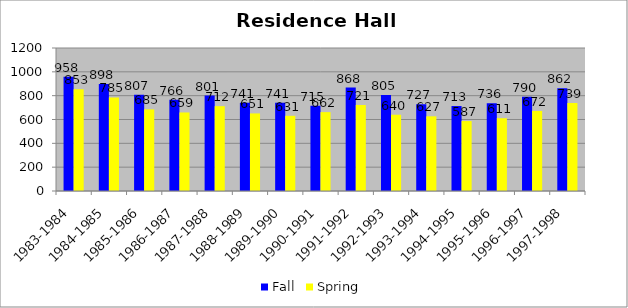
| Category | Fall | Spring |
|---|---|---|
| 1983-1984 | 958 | 853 |
| 1984-1985 | 898 | 785 |
| 1985-1986 | 807 | 685 |
| 1986-1987 | 766 | 659 |
| 1987-1988 | 801 | 712 |
| 1988-1989 | 741 | 651 |
| 1989-1990 | 741 | 631 |
| 1990-1991 | 715 | 662 |
| 1991-1992 | 868 | 721 |
| 1992-1993 | 805 | 640 |
| 1993-1994 | 727 | 627 |
| 1994-1995 | 713 | 587 |
| 1995-1996 | 736 | 611 |
| 1996-1997 | 790 | 672 |
| 1997-1998 | 862 | 739 |